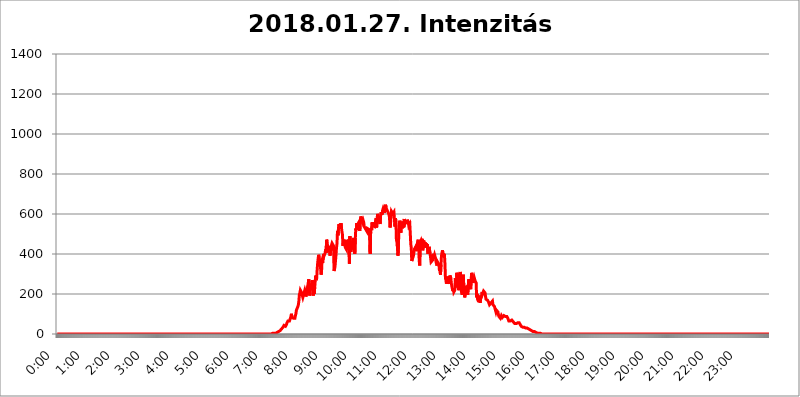
| Category | 2018.01.27. Intenzitás [W/m^2] |
|---|---|
| 0.0 | 0 |
| 0.0006944444444444445 | 0 |
| 0.001388888888888889 | 0 |
| 0.0020833333333333333 | 0 |
| 0.002777777777777778 | 0 |
| 0.003472222222222222 | 0 |
| 0.004166666666666667 | 0 |
| 0.004861111111111111 | 0 |
| 0.005555555555555556 | 0 |
| 0.0062499999999999995 | 0 |
| 0.006944444444444444 | 0 |
| 0.007638888888888889 | 0 |
| 0.008333333333333333 | 0 |
| 0.009027777777777779 | 0 |
| 0.009722222222222222 | 0 |
| 0.010416666666666666 | 0 |
| 0.011111111111111112 | 0 |
| 0.011805555555555555 | 0 |
| 0.012499999999999999 | 0 |
| 0.013194444444444444 | 0 |
| 0.013888888888888888 | 0 |
| 0.014583333333333332 | 0 |
| 0.015277777777777777 | 0 |
| 0.015972222222222224 | 0 |
| 0.016666666666666666 | 0 |
| 0.017361111111111112 | 0 |
| 0.018055555555555557 | 0 |
| 0.01875 | 0 |
| 0.019444444444444445 | 0 |
| 0.02013888888888889 | 0 |
| 0.020833333333333332 | 0 |
| 0.02152777777777778 | 0 |
| 0.022222222222222223 | 0 |
| 0.02291666666666667 | 0 |
| 0.02361111111111111 | 0 |
| 0.024305555555555556 | 0 |
| 0.024999999999999998 | 0 |
| 0.025694444444444447 | 0 |
| 0.02638888888888889 | 0 |
| 0.027083333333333334 | 0 |
| 0.027777777777777776 | 0 |
| 0.02847222222222222 | 0 |
| 0.029166666666666664 | 0 |
| 0.029861111111111113 | 0 |
| 0.030555555555555555 | 0 |
| 0.03125 | 0 |
| 0.03194444444444445 | 0 |
| 0.03263888888888889 | 0 |
| 0.03333333333333333 | 0 |
| 0.034027777777777775 | 0 |
| 0.034722222222222224 | 0 |
| 0.035416666666666666 | 0 |
| 0.036111111111111115 | 0 |
| 0.03680555555555556 | 0 |
| 0.0375 | 0 |
| 0.03819444444444444 | 0 |
| 0.03888888888888889 | 0 |
| 0.03958333333333333 | 0 |
| 0.04027777777777778 | 0 |
| 0.04097222222222222 | 0 |
| 0.041666666666666664 | 0 |
| 0.042361111111111106 | 0 |
| 0.04305555555555556 | 0 |
| 0.043750000000000004 | 0 |
| 0.044444444444444446 | 0 |
| 0.04513888888888889 | 0 |
| 0.04583333333333334 | 0 |
| 0.04652777777777778 | 0 |
| 0.04722222222222222 | 0 |
| 0.04791666666666666 | 0 |
| 0.04861111111111111 | 0 |
| 0.049305555555555554 | 0 |
| 0.049999999999999996 | 0 |
| 0.05069444444444445 | 0 |
| 0.051388888888888894 | 0 |
| 0.052083333333333336 | 0 |
| 0.05277777777777778 | 0 |
| 0.05347222222222222 | 0 |
| 0.05416666666666667 | 0 |
| 0.05486111111111111 | 0 |
| 0.05555555555555555 | 0 |
| 0.05625 | 0 |
| 0.05694444444444444 | 0 |
| 0.057638888888888885 | 0 |
| 0.05833333333333333 | 0 |
| 0.05902777777777778 | 0 |
| 0.059722222222222225 | 0 |
| 0.06041666666666667 | 0 |
| 0.061111111111111116 | 0 |
| 0.06180555555555556 | 0 |
| 0.0625 | 0 |
| 0.06319444444444444 | 0 |
| 0.06388888888888888 | 0 |
| 0.06458333333333334 | 0 |
| 0.06527777777777778 | 0 |
| 0.06597222222222222 | 0 |
| 0.06666666666666667 | 0 |
| 0.06736111111111111 | 0 |
| 0.06805555555555555 | 0 |
| 0.06874999999999999 | 0 |
| 0.06944444444444443 | 0 |
| 0.07013888888888889 | 0 |
| 0.07083333333333333 | 0 |
| 0.07152777777777779 | 0 |
| 0.07222222222222223 | 0 |
| 0.07291666666666667 | 0 |
| 0.07361111111111111 | 0 |
| 0.07430555555555556 | 0 |
| 0.075 | 0 |
| 0.07569444444444444 | 0 |
| 0.0763888888888889 | 0 |
| 0.07708333333333334 | 0 |
| 0.07777777777777778 | 0 |
| 0.07847222222222222 | 0 |
| 0.07916666666666666 | 0 |
| 0.0798611111111111 | 0 |
| 0.08055555555555556 | 0 |
| 0.08125 | 0 |
| 0.08194444444444444 | 0 |
| 0.08263888888888889 | 0 |
| 0.08333333333333333 | 0 |
| 0.08402777777777777 | 0 |
| 0.08472222222222221 | 0 |
| 0.08541666666666665 | 0 |
| 0.08611111111111112 | 0 |
| 0.08680555555555557 | 0 |
| 0.08750000000000001 | 0 |
| 0.08819444444444445 | 0 |
| 0.08888888888888889 | 0 |
| 0.08958333333333333 | 0 |
| 0.09027777777777778 | 0 |
| 0.09097222222222222 | 0 |
| 0.09166666666666667 | 0 |
| 0.09236111111111112 | 0 |
| 0.09305555555555556 | 0 |
| 0.09375 | 0 |
| 0.09444444444444444 | 0 |
| 0.09513888888888888 | 0 |
| 0.09583333333333333 | 0 |
| 0.09652777777777777 | 0 |
| 0.09722222222222222 | 0 |
| 0.09791666666666667 | 0 |
| 0.09861111111111111 | 0 |
| 0.09930555555555555 | 0 |
| 0.09999999999999999 | 0 |
| 0.10069444444444443 | 0 |
| 0.1013888888888889 | 0 |
| 0.10208333333333335 | 0 |
| 0.10277777777777779 | 0 |
| 0.10347222222222223 | 0 |
| 0.10416666666666667 | 0 |
| 0.10486111111111111 | 0 |
| 0.10555555555555556 | 0 |
| 0.10625 | 0 |
| 0.10694444444444444 | 0 |
| 0.1076388888888889 | 0 |
| 0.10833333333333334 | 0 |
| 0.10902777777777778 | 0 |
| 0.10972222222222222 | 0 |
| 0.1111111111111111 | 0 |
| 0.11180555555555556 | 0 |
| 0.11180555555555556 | 0 |
| 0.1125 | 0 |
| 0.11319444444444444 | 0 |
| 0.11388888888888889 | 0 |
| 0.11458333333333333 | 0 |
| 0.11527777777777777 | 0 |
| 0.11597222222222221 | 0 |
| 0.11666666666666665 | 0 |
| 0.1173611111111111 | 0 |
| 0.11805555555555557 | 0 |
| 0.11944444444444445 | 0 |
| 0.12013888888888889 | 0 |
| 0.12083333333333333 | 0 |
| 0.12152777777777778 | 0 |
| 0.12222222222222223 | 0 |
| 0.12291666666666667 | 0 |
| 0.12291666666666667 | 0 |
| 0.12361111111111112 | 0 |
| 0.12430555555555556 | 0 |
| 0.125 | 0 |
| 0.12569444444444444 | 0 |
| 0.12638888888888888 | 0 |
| 0.12708333333333333 | 0 |
| 0.16875 | 0 |
| 0.12847222222222224 | 0 |
| 0.12916666666666668 | 0 |
| 0.12986111111111112 | 0 |
| 0.13055555555555556 | 0 |
| 0.13125 | 0 |
| 0.13194444444444445 | 0 |
| 0.1326388888888889 | 0 |
| 0.13333333333333333 | 0 |
| 0.13402777777777777 | 0 |
| 0.13402777777777777 | 0 |
| 0.13472222222222222 | 0 |
| 0.13541666666666666 | 0 |
| 0.1361111111111111 | 0 |
| 0.13749999999999998 | 0 |
| 0.13819444444444443 | 0 |
| 0.1388888888888889 | 0 |
| 0.13958333333333334 | 0 |
| 0.14027777777777778 | 0 |
| 0.14097222222222222 | 0 |
| 0.14166666666666666 | 0 |
| 0.1423611111111111 | 0 |
| 0.14305555555555557 | 0 |
| 0.14375000000000002 | 0 |
| 0.14444444444444446 | 0 |
| 0.1451388888888889 | 0 |
| 0.1451388888888889 | 0 |
| 0.14652777777777778 | 0 |
| 0.14722222222222223 | 0 |
| 0.14791666666666667 | 0 |
| 0.1486111111111111 | 0 |
| 0.14930555555555555 | 0 |
| 0.15 | 0 |
| 0.15069444444444444 | 0 |
| 0.15138888888888888 | 0 |
| 0.15208333333333332 | 0 |
| 0.15277777777777776 | 0 |
| 0.15347222222222223 | 0 |
| 0.15416666666666667 | 0 |
| 0.15486111111111112 | 0 |
| 0.15555555555555556 | 0 |
| 0.15625 | 0 |
| 0.15694444444444444 | 0 |
| 0.15763888888888888 | 0 |
| 0.15833333333333333 | 0 |
| 0.15902777777777777 | 0 |
| 0.15972222222222224 | 0 |
| 0.16041666666666668 | 0 |
| 0.16111111111111112 | 0 |
| 0.16180555555555556 | 0 |
| 0.1625 | 0 |
| 0.16319444444444445 | 0 |
| 0.1638888888888889 | 0 |
| 0.16458333333333333 | 0 |
| 0.16527777777777777 | 0 |
| 0.16597222222222222 | 0 |
| 0.16666666666666666 | 0 |
| 0.1673611111111111 | 0 |
| 0.16805555555555554 | 0 |
| 0.16874999999999998 | 0 |
| 0.16944444444444443 | 0 |
| 0.17013888888888887 | 0 |
| 0.1708333333333333 | 0 |
| 0.17152777777777775 | 0 |
| 0.17222222222222225 | 0 |
| 0.1729166666666667 | 0 |
| 0.17361111111111113 | 0 |
| 0.17430555555555557 | 0 |
| 0.17500000000000002 | 0 |
| 0.17569444444444446 | 0 |
| 0.1763888888888889 | 0 |
| 0.17708333333333334 | 0 |
| 0.17777777777777778 | 0 |
| 0.17847222222222223 | 0 |
| 0.17916666666666667 | 0 |
| 0.1798611111111111 | 0 |
| 0.18055555555555555 | 0 |
| 0.18125 | 0 |
| 0.18194444444444444 | 0 |
| 0.1826388888888889 | 0 |
| 0.18333333333333335 | 0 |
| 0.1840277777777778 | 0 |
| 0.18472222222222223 | 0 |
| 0.18541666666666667 | 0 |
| 0.18611111111111112 | 0 |
| 0.18680555555555556 | 0 |
| 0.1875 | 0 |
| 0.18819444444444444 | 0 |
| 0.18888888888888888 | 0 |
| 0.18958333333333333 | 0 |
| 0.19027777777777777 | 0 |
| 0.1909722222222222 | 0 |
| 0.19166666666666665 | 0 |
| 0.19236111111111112 | 0 |
| 0.19305555555555554 | 0 |
| 0.19375 | 0 |
| 0.19444444444444445 | 0 |
| 0.1951388888888889 | 0 |
| 0.19583333333333333 | 0 |
| 0.19652777777777777 | 0 |
| 0.19722222222222222 | 0 |
| 0.19791666666666666 | 0 |
| 0.1986111111111111 | 0 |
| 0.19930555555555554 | 0 |
| 0.19999999999999998 | 0 |
| 0.20069444444444443 | 0 |
| 0.20138888888888887 | 0 |
| 0.2020833333333333 | 0 |
| 0.2027777777777778 | 0 |
| 0.2034722222222222 | 0 |
| 0.2041666666666667 | 0 |
| 0.20486111111111113 | 0 |
| 0.20555555555555557 | 0 |
| 0.20625000000000002 | 0 |
| 0.20694444444444446 | 0 |
| 0.2076388888888889 | 0 |
| 0.20833333333333334 | 0 |
| 0.20902777777777778 | 0 |
| 0.20972222222222223 | 0 |
| 0.21041666666666667 | 0 |
| 0.2111111111111111 | 0 |
| 0.21180555555555555 | 0 |
| 0.2125 | 0 |
| 0.21319444444444444 | 0 |
| 0.2138888888888889 | 0 |
| 0.21458333333333335 | 0 |
| 0.2152777777777778 | 0 |
| 0.21597222222222223 | 0 |
| 0.21666666666666667 | 0 |
| 0.21736111111111112 | 0 |
| 0.21805555555555556 | 0 |
| 0.21875 | 0 |
| 0.21944444444444444 | 0 |
| 0.22013888888888888 | 0 |
| 0.22083333333333333 | 0 |
| 0.22152777777777777 | 0 |
| 0.2222222222222222 | 0 |
| 0.22291666666666665 | 0 |
| 0.2236111111111111 | 0 |
| 0.22430555555555556 | 0 |
| 0.225 | 0 |
| 0.22569444444444445 | 0 |
| 0.2263888888888889 | 0 |
| 0.22708333333333333 | 0 |
| 0.22777777777777777 | 0 |
| 0.22847222222222222 | 0 |
| 0.22916666666666666 | 0 |
| 0.2298611111111111 | 0 |
| 0.23055555555555554 | 0 |
| 0.23124999999999998 | 0 |
| 0.23194444444444443 | 0 |
| 0.23263888888888887 | 0 |
| 0.2333333333333333 | 0 |
| 0.2340277777777778 | 0 |
| 0.2347222222222222 | 0 |
| 0.2354166666666667 | 0 |
| 0.23611111111111113 | 0 |
| 0.23680555555555557 | 0 |
| 0.23750000000000002 | 0 |
| 0.23819444444444446 | 0 |
| 0.2388888888888889 | 0 |
| 0.23958333333333334 | 0 |
| 0.24027777777777778 | 0 |
| 0.24097222222222223 | 0 |
| 0.24166666666666667 | 0 |
| 0.2423611111111111 | 0 |
| 0.24305555555555555 | 0 |
| 0.24375 | 0 |
| 0.24444444444444446 | 0 |
| 0.24513888888888888 | 0 |
| 0.24583333333333335 | 0 |
| 0.2465277777777778 | 0 |
| 0.24722222222222223 | 0 |
| 0.24791666666666667 | 0 |
| 0.24861111111111112 | 0 |
| 0.24930555555555556 | 0 |
| 0.25 | 0 |
| 0.25069444444444444 | 0 |
| 0.2513888888888889 | 0 |
| 0.2520833333333333 | 0 |
| 0.25277777777777777 | 0 |
| 0.2534722222222222 | 0 |
| 0.25416666666666665 | 0 |
| 0.2548611111111111 | 0 |
| 0.2555555555555556 | 0 |
| 0.25625000000000003 | 0 |
| 0.2569444444444445 | 0 |
| 0.2576388888888889 | 0 |
| 0.25833333333333336 | 0 |
| 0.2590277777777778 | 0 |
| 0.25972222222222224 | 0 |
| 0.2604166666666667 | 0 |
| 0.2611111111111111 | 0 |
| 0.26180555555555557 | 0 |
| 0.2625 | 0 |
| 0.26319444444444445 | 0 |
| 0.2638888888888889 | 0 |
| 0.26458333333333334 | 0 |
| 0.2652777777777778 | 0 |
| 0.2659722222222222 | 0 |
| 0.26666666666666666 | 0 |
| 0.2673611111111111 | 0 |
| 0.26805555555555555 | 0 |
| 0.26875 | 0 |
| 0.26944444444444443 | 0 |
| 0.2701388888888889 | 0 |
| 0.2708333333333333 | 0 |
| 0.27152777777777776 | 0 |
| 0.2722222222222222 | 0 |
| 0.27291666666666664 | 0 |
| 0.2736111111111111 | 0 |
| 0.2743055555555555 | 0 |
| 0.27499999999999997 | 0 |
| 0.27569444444444446 | 0 |
| 0.27638888888888885 | 0 |
| 0.27708333333333335 | 0 |
| 0.2777777777777778 | 0 |
| 0.27847222222222223 | 0 |
| 0.2791666666666667 | 0 |
| 0.2798611111111111 | 0 |
| 0.28055555555555556 | 0 |
| 0.28125 | 0 |
| 0.28194444444444444 | 0 |
| 0.2826388888888889 | 0 |
| 0.2833333333333333 | 0 |
| 0.28402777777777777 | 0 |
| 0.2847222222222222 | 0 |
| 0.28541666666666665 | 0 |
| 0.28611111111111115 | 0 |
| 0.28680555555555554 | 0 |
| 0.28750000000000003 | 0 |
| 0.2881944444444445 | 0 |
| 0.2888888888888889 | 0 |
| 0.28958333333333336 | 0 |
| 0.2902777777777778 | 0 |
| 0.29097222222222224 | 0 |
| 0.2916666666666667 | 0 |
| 0.2923611111111111 | 0 |
| 0.29305555555555557 | 0 |
| 0.29375 | 0 |
| 0.29444444444444445 | 0 |
| 0.2951388888888889 | 0 |
| 0.29583333333333334 | 0 |
| 0.2965277777777778 | 0 |
| 0.2972222222222222 | 0 |
| 0.29791666666666666 | 0 |
| 0.2986111111111111 | 0 |
| 0.29930555555555555 | 0 |
| 0.3 | 0 |
| 0.30069444444444443 | 0 |
| 0.3013888888888889 | 0 |
| 0.3020833333333333 | 3.525 |
| 0.30277777777777776 | 3.525 |
| 0.3034722222222222 | 3.525 |
| 0.30416666666666664 | 3.525 |
| 0.3048611111111111 | 3.525 |
| 0.3055555555555555 | 3.525 |
| 0.30624999999999997 | 3.525 |
| 0.3069444444444444 | 7.887 |
| 0.3076388888888889 | 7.887 |
| 0.30833333333333335 | 7.887 |
| 0.3090277777777778 | 12.257 |
| 0.30972222222222223 | 12.257 |
| 0.3104166666666667 | 12.257 |
| 0.3111111111111111 | 12.257 |
| 0.31180555555555556 | 16.636 |
| 0.3125 | 16.636 |
| 0.31319444444444444 | 21.024 |
| 0.3138888888888889 | 21.024 |
| 0.3145833333333333 | 25.419 |
| 0.31527777777777777 | 29.823 |
| 0.3159722222222222 | 29.823 |
| 0.31666666666666665 | 34.234 |
| 0.31736111111111115 | 38.653 |
| 0.31805555555555554 | 43.079 |
| 0.31875000000000003 | 38.653 |
| 0.3194444444444445 | 38.653 |
| 0.3201388888888889 | 38.653 |
| 0.32083333333333336 | 43.079 |
| 0.3215277777777778 | 47.511 |
| 0.32222222222222224 | 56.398 |
| 0.3229166666666667 | 60.85 |
| 0.3236111111111111 | 65.31 |
| 0.32430555555555557 | 65.31 |
| 0.325 | 60.85 |
| 0.32569444444444445 | 65.31 |
| 0.3263888888888889 | 65.31 |
| 0.32708333333333334 | 69.775 |
| 0.3277777777777778 | 87.692 |
| 0.3284722222222222 | 101.184 |
| 0.32916666666666666 | 83.205 |
| 0.3298611111111111 | 87.692 |
| 0.33055555555555555 | 87.692 |
| 0.33125 | 78.722 |
| 0.33194444444444443 | 83.205 |
| 0.3326388888888889 | 83.205 |
| 0.3333333333333333 | 78.722 |
| 0.3340277777777778 | 92.184 |
| 0.3347222222222222 | 101.184 |
| 0.3354166666666667 | 119.235 |
| 0.3361111111111111 | 119.235 |
| 0.3368055555555556 | 119.235 |
| 0.33749999999999997 | 137.347 |
| 0.33819444444444446 | 146.423 |
| 0.33888888888888885 | 164.605 |
| 0.33958333333333335 | 196.497 |
| 0.34027777777777773 | 205.62 |
| 0.34097222222222223 | 219.309 |
| 0.3416666666666666 | 214.746 |
| 0.3423611111111111 | 210.182 |
| 0.3430555555555555 | 201.058 |
| 0.34375 | 196.497 |
| 0.3444444444444445 | 182.82 |
| 0.3451388888888889 | 182.82 |
| 0.3458333333333334 | 201.058 |
| 0.34652777777777777 | 210.182 |
| 0.34722222222222227 | 219.309 |
| 0.34791666666666665 | 210.182 |
| 0.34861111111111115 | 187.378 |
| 0.34930555555555554 | 182.82 |
| 0.35000000000000003 | 205.62 |
| 0.3506944444444444 | 228.436 |
| 0.3513888888888889 | 233 |
| 0.3520833333333333 | 255.813 |
| 0.3527777777777778 | 274.047 |
| 0.3534722222222222 | 233 |
| 0.3541666666666667 | 191.937 |
| 0.3548611111111111 | 233 |
| 0.35555555555555557 | 251.251 |
| 0.35625 | 219.309 |
| 0.35694444444444445 | 251.251 |
| 0.3576388888888889 | 269.49 |
| 0.35833333333333334 | 242.127 |
| 0.3590277777777778 | 191.937 |
| 0.3597222222222222 | 228.436 |
| 0.36041666666666666 | 201.058 |
| 0.3611111111111111 | 233 |
| 0.36180555555555555 | 264.932 |
| 0.3625 | 292.259 |
| 0.36319444444444443 | 269.49 |
| 0.3638888888888889 | 278.603 |
| 0.3645833333333333 | 324.052 |
| 0.3652777777777778 | 355.712 |
| 0.3659722222222222 | 378.224 |
| 0.3666666666666667 | 396.164 |
| 0.3673611111111111 | 382.715 |
| 0.3680555555555556 | 387.202 |
| 0.36874999999999997 | 351.198 |
| 0.36944444444444446 | 355.712 |
| 0.37013888888888885 | 296.808 |
| 0.37083333333333335 | 324.052 |
| 0.37152777777777773 | 378.224 |
| 0.37222222222222223 | 355.712 |
| 0.3729166666666666 | 387.202 |
| 0.3736111111111111 | 400.638 |
| 0.3743055555555555 | 391.685 |
| 0.375 | 396.164 |
| 0.3756944444444445 | 405.108 |
| 0.3763888888888889 | 422.943 |
| 0.3770833333333334 | 405.108 |
| 0.37777777777777777 | 471.582 |
| 0.37847222222222227 | 462.786 |
| 0.37916666666666665 | 436.27 |
| 0.37986111111111115 | 409.574 |
| 0.38055555555555554 | 431.833 |
| 0.38125000000000003 | 440.702 |
| 0.3819444444444444 | 409.574 |
| 0.3826388888888889 | 391.685 |
| 0.3833333333333333 | 414.035 |
| 0.3840277777777778 | 431.833 |
| 0.3847222222222222 | 445.129 |
| 0.3854166666666667 | 453.968 |
| 0.3861111111111111 | 449.551 |
| 0.38680555555555557 | 453.968 |
| 0.3875 | 440.702 |
| 0.38819444444444445 | 314.98 |
| 0.3888888888888889 | 324.052 |
| 0.38958333333333334 | 337.639 |
| 0.3902777777777778 | 342.162 |
| 0.3909722222222222 | 396.164 |
| 0.39166666666666666 | 431.833 |
| 0.3923611111111111 | 453.968 |
| 0.39305555555555555 | 515.223 |
| 0.39375 | 493.475 |
| 0.39444444444444443 | 528.2 |
| 0.3951388888888889 | 549.704 |
| 0.3958333333333333 | 532.513 |
| 0.3965277777777778 | 549.704 |
| 0.3972222222222222 | 541.121 |
| 0.3979166666666667 | 553.986 |
| 0.3986111111111111 | 532.513 |
| 0.3993055555555556 | 510.885 |
| 0.39999999999999997 | 497.836 |
| 0.40069444444444446 | 440.702 |
| 0.40138888888888885 | 436.27 |
| 0.40208333333333335 | 471.582 |
| 0.40277777777777773 | 471.582 |
| 0.40347222222222223 | 440.702 |
| 0.4041666666666666 | 431.833 |
| 0.4048611111111111 | 427.39 |
| 0.4055555555555555 | 422.943 |
| 0.40625 | 471.582 |
| 0.4069444444444445 | 471.582 |
| 0.4076388888888889 | 458.38 |
| 0.4083333333333334 | 449.551 |
| 0.40902777777777777 | 418.492 |
| 0.40972222222222227 | 351.198 |
| 0.41041666666666665 | 489.108 |
| 0.41111111111111115 | 445.129 |
| 0.41180555555555554 | 409.574 |
| 0.41250000000000003 | 449.551 |
| 0.4131944444444444 | 422.943 |
| 0.4138888888888889 | 458.38 |
| 0.4145833333333333 | 471.582 |
| 0.4152777777777778 | 480.356 |
| 0.4159722222222222 | 458.38 |
| 0.4166666666666667 | 418.492 |
| 0.4173611111111111 | 400.638 |
| 0.41805555555555557 | 480.356 |
| 0.41875 | 528.2 |
| 0.41944444444444445 | 519.555 |
| 0.4201388888888889 | 553.986 |
| 0.42083333333333334 | 536.82 |
| 0.4215277777777778 | 549.704 |
| 0.4222222222222222 | 553.986 |
| 0.42291666666666666 | 558.261 |
| 0.4236111111111111 | 558.261 |
| 0.42430555555555555 | 515.223 |
| 0.425 | 562.53 |
| 0.42569444444444443 | 588.009 |
| 0.4263888888888889 | 583.779 |
| 0.4270833333333333 | 575.299 |
| 0.4277777777777778 | 566.793 |
| 0.4284722222222222 | 558.261 |
| 0.4291666666666667 | 566.793 |
| 0.4298611111111111 | 558.261 |
| 0.4305555555555556 | 536.82 |
| 0.43124999999999997 | 532.513 |
| 0.43194444444444446 | 536.82 |
| 0.43263888888888885 | 523.88 |
| 0.43333333333333335 | 523.88 |
| 0.43402777777777773 | 515.223 |
| 0.43472222222222223 | 528.2 |
| 0.4354166666666666 | 532.513 |
| 0.4361111111111111 | 532.513 |
| 0.4368055555555555 | 523.88 |
| 0.4375 | 493.475 |
| 0.4381944444444445 | 515.223 |
| 0.4388888888888889 | 400.638 |
| 0.4395833333333334 | 510.885 |
| 0.44027777777777777 | 528.2 |
| 0.44097222222222227 | 519.555 |
| 0.44166666666666665 | 558.261 |
| 0.44236111111111115 | 558.261 |
| 0.44305555555555554 | 541.121 |
| 0.44375000000000003 | 545.416 |
| 0.4444444444444444 | 545.416 |
| 0.4451388888888889 | 536.82 |
| 0.4458333333333333 | 549.704 |
| 0.4465277777777778 | 566.793 |
| 0.4472222222222222 | 579.542 |
| 0.4479166666666667 | 532.513 |
| 0.4486111111111111 | 575.299 |
| 0.44930555555555557 | 600.661 |
| 0.45 | 588.009 |
| 0.45069444444444445 | 583.779 |
| 0.4513888888888889 | 571.049 |
| 0.45208333333333334 | 566.793 |
| 0.4527777777777778 | 549.704 |
| 0.4534722222222222 | 588.009 |
| 0.45416666666666666 | 609.062 |
| 0.4548611111111111 | 604.864 |
| 0.45555555555555555 | 596.45 |
| 0.45625 | 617.436 |
| 0.45694444444444443 | 625.784 |
| 0.4576388888888889 | 617.436 |
| 0.4583333333333333 | 613.252 |
| 0.4590277777777778 | 604.864 |
| 0.4597222222222222 | 638.256 |
| 0.4604166666666667 | 646.537 |
| 0.4611111111111111 | 634.105 |
| 0.4618055555555556 | 625.784 |
| 0.46249999999999997 | 625.784 |
| 0.46319444444444446 | 629.948 |
| 0.46388888888888885 | 609.062 |
| 0.46458333333333335 | 609.062 |
| 0.46527777777777773 | 596.45 |
| 0.46597222222222223 | 583.779 |
| 0.4666666666666666 | 532.513 |
| 0.4673611111111111 | 545.416 |
| 0.4680555555555555 | 583.779 |
| 0.46875 | 613.252 |
| 0.4694444444444445 | 609.062 |
| 0.4701388888888889 | 609.062 |
| 0.4708333333333334 | 600.661 |
| 0.47152777777777777 | 604.864 |
| 0.47222222222222227 | 609.062 |
| 0.47291666666666665 | 575.299 |
| 0.47361111111111115 | 536.82 |
| 0.47430555555555554 | 579.542 |
| 0.47500000000000003 | 562.53 |
| 0.4756944444444444 | 467.187 |
| 0.4763888888888889 | 475.972 |
| 0.4770833333333333 | 436.27 |
| 0.4777777777777778 | 391.685 |
| 0.4784722222222222 | 422.943 |
| 0.4791666666666667 | 532.513 |
| 0.4798611111111111 | 553.986 |
| 0.48055555555555557 | 566.793 |
| 0.48125 | 515.223 |
| 0.48194444444444445 | 506.542 |
| 0.4826388888888889 | 558.261 |
| 0.48333333333333334 | 541.121 |
| 0.4840277777777778 | 528.2 |
| 0.4847222222222222 | 562.53 |
| 0.48541666666666666 | 549.704 |
| 0.4861111111111111 | 532.513 |
| 0.48680555555555555 | 575.299 |
| 0.4875 | 549.704 |
| 0.48819444444444443 | 545.416 |
| 0.4888888888888889 | 549.704 |
| 0.4895833333333333 | 558.261 |
| 0.4902777777777778 | 549.704 |
| 0.4909722222222222 | 571.049 |
| 0.4916666666666667 | 566.793 |
| 0.4923611111111111 | 558.261 |
| 0.4930555555555556 | 541.121 |
| 0.49374999999999997 | 541.121 |
| 0.49444444444444446 | 549.704 |
| 0.49513888888888885 | 502.192 |
| 0.49583333333333335 | 449.551 |
| 0.49652777777777773 | 431.833 |
| 0.49722222222222223 | 364.728 |
| 0.4979166666666666 | 373.729 |
| 0.4986111111111111 | 378.224 |
| 0.4993055555555555 | 387.202 |
| 0.5 | 400.638 |
| 0.5006944444444444 | 422.943 |
| 0.5013888888888889 | 422.943 |
| 0.5020833333333333 | 431.833 |
| 0.5027777777777778 | 431.833 |
| 0.5034722222222222 | 414.035 |
| 0.5041666666666667 | 414.035 |
| 0.5048611111111111 | 449.551 |
| 0.5055555555555555 | 462.786 |
| 0.50625 | 471.582 |
| 0.5069444444444444 | 440.702 |
| 0.5076388888888889 | 369.23 |
| 0.5083333333333333 | 342.162 |
| 0.5090277777777777 | 453.968 |
| 0.5097222222222222 | 458.38 |
| 0.5104166666666666 | 467.187 |
| 0.5111111111111112 | 458.38 |
| 0.5118055555555555 | 475.972 |
| 0.5125000000000001 | 418.492 |
| 0.5131944444444444 | 449.551 |
| 0.513888888888889 | 467.187 |
| 0.5145833333333333 | 462.786 |
| 0.5152777777777778 | 449.551 |
| 0.5159722222222222 | 458.38 |
| 0.5166666666666667 | 445.129 |
| 0.517361111111111 | 453.968 |
| 0.5180555555555556 | 431.833 |
| 0.5187499999999999 | 449.551 |
| 0.5194444444444445 | 453.968 |
| 0.5201388888888888 | 400.638 |
| 0.5208333333333334 | 427.39 |
| 0.5215277777777778 | 436.27 |
| 0.5222222222222223 | 436.27 |
| 0.5229166666666667 | 400.638 |
| 0.5236111111111111 | 382.715 |
| 0.5243055555555556 | 360.221 |
| 0.525 | 364.728 |
| 0.5256944444444445 | 360.221 |
| 0.5263888888888889 | 369.23 |
| 0.5270833333333333 | 391.685 |
| 0.5277777777777778 | 400.638 |
| 0.5284722222222222 | 387.202 |
| 0.5291666666666667 | 396.164 |
| 0.5298611111111111 | 387.202 |
| 0.5305555555555556 | 378.224 |
| 0.53125 | 360.221 |
| 0.5319444444444444 | 360.221 |
| 0.5326388888888889 | 342.162 |
| 0.5333333333333333 | 360.221 |
| 0.5340277777777778 | 360.221 |
| 0.5347222222222222 | 351.198 |
| 0.5354166666666667 | 342.162 |
| 0.5361111111111111 | 314.98 |
| 0.5368055555555555 | 324.052 |
| 0.5375 | 296.808 |
| 0.5381944444444444 | 346.682 |
| 0.5388888888888889 | 391.685 |
| 0.5395833333333333 | 405.108 |
| 0.5402777777777777 | 418.492 |
| 0.5409722222222222 | 400.638 |
| 0.5416666666666666 | 396.164 |
| 0.5423611111111112 | 396.164 |
| 0.5430555555555555 | 396.164 |
| 0.5437500000000001 | 351.198 |
| 0.5444444444444444 | 278.603 |
| 0.545138888888889 | 269.49 |
| 0.5458333333333333 | 251.251 |
| 0.5465277777777778 | 251.251 |
| 0.5472222222222222 | 278.603 |
| 0.5479166666666667 | 287.709 |
| 0.548611111111111 | 264.932 |
| 0.5493055555555556 | 260.373 |
| 0.5499999999999999 | 251.251 |
| 0.5506944444444445 | 292.259 |
| 0.5513888888888888 | 292.259 |
| 0.5520833333333334 | 278.603 |
| 0.5527777777777778 | 251.251 |
| 0.5534722222222223 | 237.564 |
| 0.5541666666666667 | 233 |
| 0.5548611111111111 | 214.746 |
| 0.5555555555555556 | 228.436 |
| 0.55625 | 210.182 |
| 0.5569444444444445 | 214.746 |
| 0.5576388888888889 | 219.309 |
| 0.5583333333333333 | 278.603 |
| 0.5590277777777778 | 246.689 |
| 0.5597222222222222 | 233 |
| 0.5604166666666667 | 305.898 |
| 0.5611111111111111 | 301.354 |
| 0.5618055555555556 | 269.49 |
| 0.5625 | 283.156 |
| 0.5631944444444444 | 219.309 |
| 0.5638888888888889 | 301.354 |
| 0.5645833333333333 | 228.436 |
| 0.5652777777777778 | 310.44 |
| 0.5659722222222222 | 274.047 |
| 0.5666666666666667 | 214.746 |
| 0.5673611111111111 | 205.62 |
| 0.5680555555555555 | 196.497 |
| 0.56875 | 260.373 |
| 0.5694444444444444 | 296.808 |
| 0.5701388888888889 | 242.127 |
| 0.5708333333333333 | 205.62 |
| 0.5715277777777777 | 182.82 |
| 0.5722222222222222 | 205.62 |
| 0.5729166666666666 | 201.058 |
| 0.5736111111111112 | 219.309 |
| 0.5743055555555555 | 242.127 |
| 0.5750000000000001 | 210.182 |
| 0.5756944444444444 | 196.497 |
| 0.576388888888889 | 237.564 |
| 0.5770833333333333 | 274.047 |
| 0.5777777777777778 | 269.49 |
| 0.5784722222222222 | 269.49 |
| 0.5791666666666667 | 233 |
| 0.579861111111111 | 223.873 |
| 0.5805555555555556 | 274.047 |
| 0.5812499999999999 | 305.898 |
| 0.5819444444444445 | 292.259 |
| 0.5826388888888888 | 255.813 |
| 0.5833333333333334 | 264.932 |
| 0.5840277777777778 | 274.047 |
| 0.5847222222222223 | 283.156 |
| 0.5854166666666667 | 274.047 |
| 0.5861111111111111 | 264.932 |
| 0.5868055555555556 | 264.932 |
| 0.5875 | 255.813 |
| 0.5881944444444445 | 182.82 |
| 0.5888888888888889 | 201.058 |
| 0.5895833333333333 | 173.709 |
| 0.5902777777777778 | 169.156 |
| 0.5909722222222222 | 160.056 |
| 0.5916666666666667 | 191.937 |
| 0.5923611111111111 | 173.709 |
| 0.5930555555555556 | 155.509 |
| 0.59375 | 173.709 |
| 0.5944444444444444 | 178.264 |
| 0.5951388888888889 | 191.937 |
| 0.5958333333333333 | 210.182 |
| 0.5965277777777778 | 201.058 |
| 0.5972222222222222 | 205.62 |
| 0.5979166666666667 | 214.746 |
| 0.5986111111111111 | 219.309 |
| 0.5993055555555555 | 210.182 |
| 0.6 | 205.62 |
| 0.6006944444444444 | 187.378 |
| 0.6013888888888889 | 173.709 |
| 0.6020833333333333 | 173.709 |
| 0.6027777777777777 | 169.156 |
| 0.6034722222222222 | 169.156 |
| 0.6041666666666666 | 173.709 |
| 0.6048611111111112 | 160.056 |
| 0.6055555555555555 | 164.605 |
| 0.6062500000000001 | 146.423 |
| 0.6069444444444444 | 141.884 |
| 0.607638888888889 | 141.884 |
| 0.6083333333333333 | 155.509 |
| 0.6090277777777778 | 155.509 |
| 0.6097222222222222 | 155.509 |
| 0.6104166666666667 | 164.605 |
| 0.611111111111111 | 146.423 |
| 0.6118055555555556 | 146.423 |
| 0.6124999999999999 | 150.964 |
| 0.6131944444444445 | 137.347 |
| 0.6138888888888888 | 132.814 |
| 0.6145833333333334 | 119.235 |
| 0.6152777777777778 | 110.201 |
| 0.6159722222222223 | 119.235 |
| 0.6166666666666667 | 119.235 |
| 0.6173611111111111 | 119.235 |
| 0.6180555555555556 | 110.201 |
| 0.61875 | 96.682 |
| 0.6194444444444445 | 87.692 |
| 0.6201388888888889 | 83.205 |
| 0.6208333333333333 | 83.205 |
| 0.6215277777777778 | 78.722 |
| 0.6222222222222222 | 83.205 |
| 0.6229166666666667 | 92.184 |
| 0.6236111111111111 | 96.682 |
| 0.6243055555555556 | 83.205 |
| 0.625 | 83.205 |
| 0.6256944444444444 | 87.692 |
| 0.6263888888888889 | 92.184 |
| 0.6270833333333333 | 96.682 |
| 0.6277777777777778 | 92.184 |
| 0.6284722222222222 | 87.692 |
| 0.6291666666666667 | 83.205 |
| 0.6298611111111111 | 87.692 |
| 0.6305555555555555 | 87.692 |
| 0.63125 | 83.205 |
| 0.6319444444444444 | 78.722 |
| 0.6326388888888889 | 74.246 |
| 0.6333333333333333 | 65.31 |
| 0.6340277777777777 | 65.31 |
| 0.6347222222222222 | 65.31 |
| 0.6354166666666666 | 65.31 |
| 0.6361111111111112 | 65.31 |
| 0.6368055555555555 | 69.775 |
| 0.6375000000000001 | 69.775 |
| 0.6381944444444444 | 65.31 |
| 0.638888888888889 | 65.31 |
| 0.6395833333333333 | 60.85 |
| 0.6402777777777778 | 56.398 |
| 0.6409722222222222 | 56.398 |
| 0.6416666666666667 | 51.951 |
| 0.642361111111111 | 51.951 |
| 0.6430555555555556 | 51.951 |
| 0.6437499999999999 | 51.951 |
| 0.6444444444444445 | 56.398 |
| 0.6451388888888888 | 56.398 |
| 0.6458333333333334 | 56.398 |
| 0.6465277777777778 | 56.398 |
| 0.6472222222222223 | 56.398 |
| 0.6479166666666667 | 56.398 |
| 0.6486111111111111 | 51.951 |
| 0.6493055555555556 | 47.511 |
| 0.65 | 47.511 |
| 0.6506944444444445 | 38.653 |
| 0.6513888888888889 | 38.653 |
| 0.6520833333333333 | 38.653 |
| 0.6527777777777778 | 34.234 |
| 0.6534722222222222 | 34.234 |
| 0.6541666666666667 | 34.234 |
| 0.6548611111111111 | 34.234 |
| 0.6555555555555556 | 34.234 |
| 0.65625 | 29.823 |
| 0.6569444444444444 | 29.823 |
| 0.6576388888888889 | 29.823 |
| 0.6583333333333333 | 29.823 |
| 0.6590277777777778 | 29.823 |
| 0.6597222222222222 | 29.823 |
| 0.6604166666666667 | 25.419 |
| 0.6611111111111111 | 25.419 |
| 0.6618055555555555 | 25.419 |
| 0.6625 | 21.024 |
| 0.6631944444444444 | 21.024 |
| 0.6638888888888889 | 21.024 |
| 0.6645833333333333 | 21.024 |
| 0.6652777777777777 | 16.636 |
| 0.6659722222222222 | 16.636 |
| 0.6666666666666666 | 16.636 |
| 0.6673611111111111 | 12.257 |
| 0.6680555555555556 | 12.257 |
| 0.6687500000000001 | 12.257 |
| 0.6694444444444444 | 12.257 |
| 0.6701388888888888 | 12.257 |
| 0.6708333333333334 | 7.887 |
| 0.6715277777777778 | 7.887 |
| 0.6722222222222222 | 7.887 |
| 0.6729166666666666 | 7.887 |
| 0.6736111111111112 | 3.525 |
| 0.6743055555555556 | 3.525 |
| 0.6749999999999999 | 3.525 |
| 0.6756944444444444 | 3.525 |
| 0.6763888888888889 | 3.525 |
| 0.6770833333333334 | 3.525 |
| 0.6777777777777777 | 3.525 |
| 0.6784722222222223 | 3.525 |
| 0.6791666666666667 | 3.525 |
| 0.6798611111111111 | 0 |
| 0.6805555555555555 | 0 |
| 0.68125 | 0 |
| 0.6819444444444445 | 0 |
| 0.6826388888888889 | 0 |
| 0.6833333333333332 | 0 |
| 0.6840277777777778 | 0 |
| 0.6847222222222222 | 0 |
| 0.6854166666666667 | 0 |
| 0.686111111111111 | 0 |
| 0.6868055555555556 | 0 |
| 0.6875 | 0 |
| 0.6881944444444444 | 0 |
| 0.688888888888889 | 0 |
| 0.6895833333333333 | 0 |
| 0.6902777777777778 | 0 |
| 0.6909722222222222 | 0 |
| 0.6916666666666668 | 0 |
| 0.6923611111111111 | 0 |
| 0.6930555555555555 | 0 |
| 0.69375 | 0 |
| 0.6944444444444445 | 0 |
| 0.6951388888888889 | 0 |
| 0.6958333333333333 | 0 |
| 0.6965277777777777 | 0 |
| 0.6972222222222223 | 0 |
| 0.6979166666666666 | 0 |
| 0.6986111111111111 | 0 |
| 0.6993055555555556 | 0 |
| 0.7000000000000001 | 0 |
| 0.7006944444444444 | 0 |
| 0.7013888888888888 | 0 |
| 0.7020833333333334 | 0 |
| 0.7027777777777778 | 0 |
| 0.7034722222222222 | 0 |
| 0.7041666666666666 | 0 |
| 0.7048611111111112 | 0 |
| 0.7055555555555556 | 0 |
| 0.7062499999999999 | 0 |
| 0.7069444444444444 | 0 |
| 0.7076388888888889 | 0 |
| 0.7083333333333334 | 0 |
| 0.7090277777777777 | 0 |
| 0.7097222222222223 | 0 |
| 0.7104166666666667 | 0 |
| 0.7111111111111111 | 0 |
| 0.7118055555555555 | 0 |
| 0.7125 | 0 |
| 0.7131944444444445 | 0 |
| 0.7138888888888889 | 0 |
| 0.7145833333333332 | 0 |
| 0.7152777777777778 | 0 |
| 0.7159722222222222 | 0 |
| 0.7166666666666667 | 0 |
| 0.717361111111111 | 0 |
| 0.7180555555555556 | 0 |
| 0.71875 | 0 |
| 0.7194444444444444 | 0 |
| 0.720138888888889 | 0 |
| 0.7208333333333333 | 0 |
| 0.7215277777777778 | 0 |
| 0.7222222222222222 | 0 |
| 0.7229166666666668 | 0 |
| 0.7236111111111111 | 0 |
| 0.7243055555555555 | 0 |
| 0.725 | 0 |
| 0.7256944444444445 | 0 |
| 0.7263888888888889 | 0 |
| 0.7270833333333333 | 0 |
| 0.7277777777777777 | 0 |
| 0.7284722222222223 | 0 |
| 0.7291666666666666 | 0 |
| 0.7298611111111111 | 0 |
| 0.7305555555555556 | 0 |
| 0.7312500000000001 | 0 |
| 0.7319444444444444 | 0 |
| 0.7326388888888888 | 0 |
| 0.7333333333333334 | 0 |
| 0.7340277777777778 | 0 |
| 0.7347222222222222 | 0 |
| 0.7354166666666666 | 0 |
| 0.7361111111111112 | 0 |
| 0.7368055555555556 | 0 |
| 0.7374999999999999 | 0 |
| 0.7381944444444444 | 0 |
| 0.7388888888888889 | 0 |
| 0.7395833333333334 | 0 |
| 0.7402777777777777 | 0 |
| 0.7409722222222223 | 0 |
| 0.7416666666666667 | 0 |
| 0.7423611111111111 | 0 |
| 0.7430555555555555 | 0 |
| 0.74375 | 0 |
| 0.7444444444444445 | 0 |
| 0.7451388888888889 | 0 |
| 0.7458333333333332 | 0 |
| 0.7465277777777778 | 0 |
| 0.7472222222222222 | 0 |
| 0.7479166666666667 | 0 |
| 0.748611111111111 | 0 |
| 0.7493055555555556 | 0 |
| 0.75 | 0 |
| 0.7506944444444444 | 0 |
| 0.751388888888889 | 0 |
| 0.7520833333333333 | 0 |
| 0.7527777777777778 | 0 |
| 0.7534722222222222 | 0 |
| 0.7541666666666668 | 0 |
| 0.7548611111111111 | 0 |
| 0.7555555555555555 | 0 |
| 0.75625 | 0 |
| 0.7569444444444445 | 0 |
| 0.7576388888888889 | 0 |
| 0.7583333333333333 | 0 |
| 0.7590277777777777 | 0 |
| 0.7597222222222223 | 0 |
| 0.7604166666666666 | 0 |
| 0.7611111111111111 | 0 |
| 0.7618055555555556 | 0 |
| 0.7625000000000001 | 0 |
| 0.7631944444444444 | 0 |
| 0.7638888888888888 | 0 |
| 0.7645833333333334 | 0 |
| 0.7652777777777778 | 0 |
| 0.7659722222222222 | 0 |
| 0.7666666666666666 | 0 |
| 0.7673611111111112 | 0 |
| 0.7680555555555556 | 0 |
| 0.7687499999999999 | 0 |
| 0.7694444444444444 | 0 |
| 0.7701388888888889 | 0 |
| 0.7708333333333334 | 0 |
| 0.7715277777777777 | 0 |
| 0.7722222222222223 | 0 |
| 0.7729166666666667 | 0 |
| 0.7736111111111111 | 0 |
| 0.7743055555555555 | 0 |
| 0.775 | 0 |
| 0.7756944444444445 | 0 |
| 0.7763888888888889 | 0 |
| 0.7770833333333332 | 0 |
| 0.7777777777777778 | 0 |
| 0.7784722222222222 | 0 |
| 0.7791666666666667 | 0 |
| 0.779861111111111 | 0 |
| 0.7805555555555556 | 0 |
| 0.78125 | 0 |
| 0.7819444444444444 | 0 |
| 0.782638888888889 | 0 |
| 0.7833333333333333 | 0 |
| 0.7840277777777778 | 0 |
| 0.7847222222222222 | 0 |
| 0.7854166666666668 | 0 |
| 0.7861111111111111 | 0 |
| 0.7868055555555555 | 0 |
| 0.7875 | 0 |
| 0.7881944444444445 | 0 |
| 0.7888888888888889 | 0 |
| 0.7895833333333333 | 0 |
| 0.7902777777777777 | 0 |
| 0.7909722222222223 | 0 |
| 0.7916666666666666 | 0 |
| 0.7923611111111111 | 0 |
| 0.7930555555555556 | 0 |
| 0.7937500000000001 | 0 |
| 0.7944444444444444 | 0 |
| 0.7951388888888888 | 0 |
| 0.7958333333333334 | 0 |
| 0.7965277777777778 | 0 |
| 0.7972222222222222 | 0 |
| 0.7979166666666666 | 0 |
| 0.7986111111111112 | 0 |
| 0.7993055555555556 | 0 |
| 0.7999999999999999 | 0 |
| 0.8006944444444444 | 0 |
| 0.8013888888888889 | 0 |
| 0.8020833333333334 | 0 |
| 0.8027777777777777 | 0 |
| 0.8034722222222223 | 0 |
| 0.8041666666666667 | 0 |
| 0.8048611111111111 | 0 |
| 0.8055555555555555 | 0 |
| 0.80625 | 0 |
| 0.8069444444444445 | 0 |
| 0.8076388888888889 | 0 |
| 0.8083333333333332 | 0 |
| 0.8090277777777778 | 0 |
| 0.8097222222222222 | 0 |
| 0.8104166666666667 | 0 |
| 0.811111111111111 | 0 |
| 0.8118055555555556 | 0 |
| 0.8125 | 0 |
| 0.8131944444444444 | 0 |
| 0.813888888888889 | 0 |
| 0.8145833333333333 | 0 |
| 0.8152777777777778 | 0 |
| 0.8159722222222222 | 0 |
| 0.8166666666666668 | 0 |
| 0.8173611111111111 | 0 |
| 0.8180555555555555 | 0 |
| 0.81875 | 0 |
| 0.8194444444444445 | 0 |
| 0.8201388888888889 | 0 |
| 0.8208333333333333 | 0 |
| 0.8215277777777777 | 0 |
| 0.8222222222222223 | 0 |
| 0.8229166666666666 | 0 |
| 0.8236111111111111 | 0 |
| 0.8243055555555556 | 0 |
| 0.8250000000000001 | 0 |
| 0.8256944444444444 | 0 |
| 0.8263888888888888 | 0 |
| 0.8270833333333334 | 0 |
| 0.8277777777777778 | 0 |
| 0.8284722222222222 | 0 |
| 0.8291666666666666 | 0 |
| 0.8298611111111112 | 0 |
| 0.8305555555555556 | 0 |
| 0.8312499999999999 | 0 |
| 0.8319444444444444 | 0 |
| 0.8326388888888889 | 0 |
| 0.8333333333333334 | 0 |
| 0.8340277777777777 | 0 |
| 0.8347222222222223 | 0 |
| 0.8354166666666667 | 0 |
| 0.8361111111111111 | 0 |
| 0.8368055555555555 | 0 |
| 0.8375 | 0 |
| 0.8381944444444445 | 0 |
| 0.8388888888888889 | 0 |
| 0.8395833333333332 | 0 |
| 0.8402777777777778 | 0 |
| 0.8409722222222222 | 0 |
| 0.8416666666666667 | 0 |
| 0.842361111111111 | 0 |
| 0.8430555555555556 | 0 |
| 0.84375 | 0 |
| 0.8444444444444444 | 0 |
| 0.845138888888889 | 0 |
| 0.8458333333333333 | 0 |
| 0.8465277777777778 | 0 |
| 0.8472222222222222 | 0 |
| 0.8479166666666668 | 0 |
| 0.8486111111111111 | 0 |
| 0.8493055555555555 | 0 |
| 0.85 | 0 |
| 0.8506944444444445 | 0 |
| 0.8513888888888889 | 0 |
| 0.8520833333333333 | 0 |
| 0.8527777777777777 | 0 |
| 0.8534722222222223 | 0 |
| 0.8541666666666666 | 0 |
| 0.8548611111111111 | 0 |
| 0.8555555555555556 | 0 |
| 0.8562500000000001 | 0 |
| 0.8569444444444444 | 0 |
| 0.8576388888888888 | 0 |
| 0.8583333333333334 | 0 |
| 0.8590277777777778 | 0 |
| 0.8597222222222222 | 0 |
| 0.8604166666666666 | 0 |
| 0.8611111111111112 | 0 |
| 0.8618055555555556 | 0 |
| 0.8624999999999999 | 0 |
| 0.8631944444444444 | 0 |
| 0.8638888888888889 | 0 |
| 0.8645833333333334 | 0 |
| 0.8652777777777777 | 0 |
| 0.8659722222222223 | 0 |
| 0.8666666666666667 | 0 |
| 0.8673611111111111 | 0 |
| 0.8680555555555555 | 0 |
| 0.86875 | 0 |
| 0.8694444444444445 | 0 |
| 0.8701388888888889 | 0 |
| 0.8708333333333332 | 0 |
| 0.8715277777777778 | 0 |
| 0.8722222222222222 | 0 |
| 0.8729166666666667 | 0 |
| 0.873611111111111 | 0 |
| 0.8743055555555556 | 0 |
| 0.875 | 0 |
| 0.8756944444444444 | 0 |
| 0.876388888888889 | 0 |
| 0.8770833333333333 | 0 |
| 0.8777777777777778 | 0 |
| 0.8784722222222222 | 0 |
| 0.8791666666666668 | 0 |
| 0.8798611111111111 | 0 |
| 0.8805555555555555 | 0 |
| 0.88125 | 0 |
| 0.8819444444444445 | 0 |
| 0.8826388888888889 | 0 |
| 0.8833333333333333 | 0 |
| 0.8840277777777777 | 0 |
| 0.8847222222222223 | 0 |
| 0.8854166666666666 | 0 |
| 0.8861111111111111 | 0 |
| 0.8868055555555556 | 0 |
| 0.8875000000000001 | 0 |
| 0.8881944444444444 | 0 |
| 0.8888888888888888 | 0 |
| 0.8895833333333334 | 0 |
| 0.8902777777777778 | 0 |
| 0.8909722222222222 | 0 |
| 0.8916666666666666 | 0 |
| 0.8923611111111112 | 0 |
| 0.8930555555555556 | 0 |
| 0.8937499999999999 | 0 |
| 0.8944444444444444 | 0 |
| 0.8951388888888889 | 0 |
| 0.8958333333333334 | 0 |
| 0.8965277777777777 | 0 |
| 0.8972222222222223 | 0 |
| 0.8979166666666667 | 0 |
| 0.8986111111111111 | 0 |
| 0.8993055555555555 | 0 |
| 0.9 | 0 |
| 0.9006944444444445 | 0 |
| 0.9013888888888889 | 0 |
| 0.9020833333333332 | 0 |
| 0.9027777777777778 | 0 |
| 0.9034722222222222 | 0 |
| 0.9041666666666667 | 0 |
| 0.904861111111111 | 0 |
| 0.9055555555555556 | 0 |
| 0.90625 | 0 |
| 0.9069444444444444 | 0 |
| 0.907638888888889 | 0 |
| 0.9083333333333333 | 0 |
| 0.9090277777777778 | 0 |
| 0.9097222222222222 | 0 |
| 0.9104166666666668 | 0 |
| 0.9111111111111111 | 0 |
| 0.9118055555555555 | 0 |
| 0.9125 | 0 |
| 0.9131944444444445 | 0 |
| 0.9138888888888889 | 0 |
| 0.9145833333333333 | 0 |
| 0.9152777777777777 | 0 |
| 0.9159722222222223 | 0 |
| 0.9166666666666666 | 0 |
| 0.9173611111111111 | 0 |
| 0.9180555555555556 | 0 |
| 0.9187500000000001 | 0 |
| 0.9194444444444444 | 0 |
| 0.9201388888888888 | 0 |
| 0.9208333333333334 | 0 |
| 0.9215277777777778 | 0 |
| 0.9222222222222222 | 0 |
| 0.9229166666666666 | 0 |
| 0.9236111111111112 | 0 |
| 0.9243055555555556 | 0 |
| 0.9249999999999999 | 0 |
| 0.9256944444444444 | 0 |
| 0.9263888888888889 | 0 |
| 0.9270833333333334 | 0 |
| 0.9277777777777777 | 0 |
| 0.9284722222222223 | 0 |
| 0.9291666666666667 | 0 |
| 0.9298611111111111 | 0 |
| 0.9305555555555555 | 0 |
| 0.93125 | 0 |
| 0.9319444444444445 | 0 |
| 0.9326388888888889 | 0 |
| 0.9333333333333332 | 0 |
| 0.9340277777777778 | 0 |
| 0.9347222222222222 | 0 |
| 0.9354166666666667 | 0 |
| 0.936111111111111 | 0 |
| 0.9368055555555556 | 0 |
| 0.9375 | 0 |
| 0.9381944444444444 | 0 |
| 0.938888888888889 | 0 |
| 0.9395833333333333 | 0 |
| 0.9402777777777778 | 0 |
| 0.9409722222222222 | 0 |
| 0.9416666666666668 | 0 |
| 0.9423611111111111 | 0 |
| 0.9430555555555555 | 0 |
| 0.94375 | 0 |
| 0.9444444444444445 | 0 |
| 0.9451388888888889 | 0 |
| 0.9458333333333333 | 0 |
| 0.9465277777777777 | 0 |
| 0.9472222222222223 | 0 |
| 0.9479166666666666 | 0 |
| 0.9486111111111111 | 0 |
| 0.9493055555555556 | 0 |
| 0.9500000000000001 | 0 |
| 0.9506944444444444 | 0 |
| 0.9513888888888888 | 0 |
| 0.9520833333333334 | 0 |
| 0.9527777777777778 | 0 |
| 0.9534722222222222 | 0 |
| 0.9541666666666666 | 0 |
| 0.9548611111111112 | 0 |
| 0.9555555555555556 | 0 |
| 0.9562499999999999 | 0 |
| 0.9569444444444444 | 0 |
| 0.9576388888888889 | 0 |
| 0.9583333333333334 | 0 |
| 0.9590277777777777 | 0 |
| 0.9597222222222223 | 0 |
| 0.9604166666666667 | 0 |
| 0.9611111111111111 | 0 |
| 0.9618055555555555 | 0 |
| 0.9625 | 0 |
| 0.9631944444444445 | 0 |
| 0.9638888888888889 | 0 |
| 0.9645833333333332 | 0 |
| 0.9652777777777778 | 0 |
| 0.9659722222222222 | 0 |
| 0.9666666666666667 | 0 |
| 0.967361111111111 | 0 |
| 0.9680555555555556 | 0 |
| 0.96875 | 0 |
| 0.9694444444444444 | 0 |
| 0.970138888888889 | 0 |
| 0.9708333333333333 | 0 |
| 0.9715277777777778 | 0 |
| 0.9722222222222222 | 0 |
| 0.9729166666666668 | 0 |
| 0.9736111111111111 | 0 |
| 0.9743055555555555 | 0 |
| 0.975 | 0 |
| 0.9756944444444445 | 0 |
| 0.9763888888888889 | 0 |
| 0.9770833333333333 | 0 |
| 0.9777777777777777 | 0 |
| 0.9784722222222223 | 0 |
| 0.9791666666666666 | 0 |
| 0.9798611111111111 | 0 |
| 0.9805555555555556 | 0 |
| 0.9812500000000001 | 0 |
| 0.9819444444444444 | 0 |
| 0.9826388888888888 | 0 |
| 0.9833333333333334 | 0 |
| 0.9840277777777778 | 0 |
| 0.9847222222222222 | 0 |
| 0.9854166666666666 | 0 |
| 0.9861111111111112 | 0 |
| 0.9868055555555556 | 0 |
| 0.9874999999999999 | 0 |
| 0.9881944444444444 | 0 |
| 0.9888888888888889 | 0 |
| 0.9895833333333334 | 0 |
| 0.9902777777777777 | 0 |
| 0.9909722222222223 | 0 |
| 0.9916666666666667 | 0 |
| 0.9923611111111111 | 0 |
| 0.9930555555555555 | 0 |
| 0.99375 | 0 |
| 0.9944444444444445 | 0 |
| 0.9951388888888889 | 0 |
| 0.9958333333333332 | 0 |
| 0.9965277777777778 | 0 |
| 0.9972222222222222 | 0 |
| 0.9979166666666667 | 0 |
| 0.998611111111111 | 0 |
| 0.9993055555555556 | 0 |